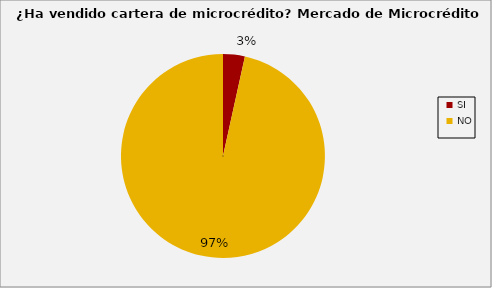
| Category | Series 0 |
|---|---|
| SI | 0.034 |
| NO | 0.966 |